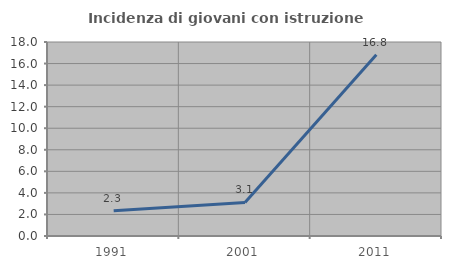
| Category | Incidenza di giovani con istruzione universitaria |
|---|---|
| 1991.0 | 2.333 |
| 2001.0 | 3.116 |
| 2011.0 | 16.822 |